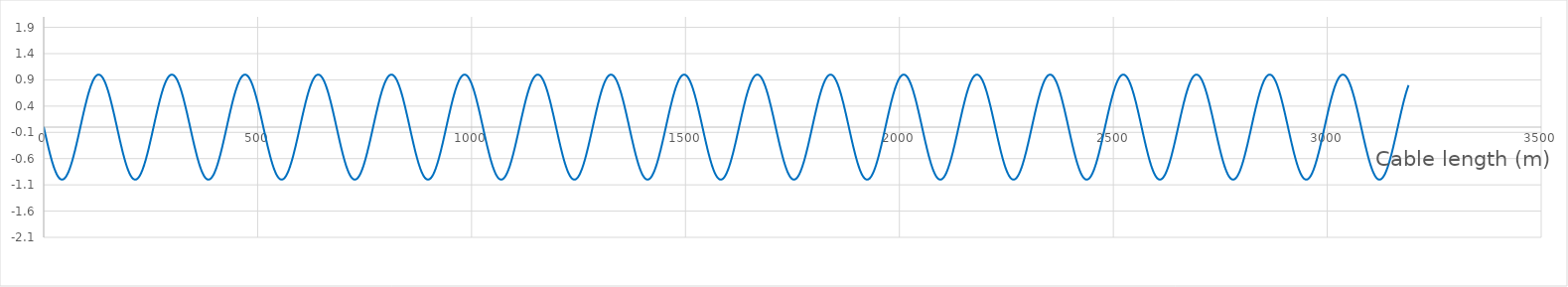
| Category | Incoming wave |
|---|---|
| 0.0 | 0.006 |
| 3.19 | -0.111 |
| 6.38 | -0.227 |
| 9.57 | -0.339 |
| 12.76 | -0.447 |
| 15.95 | -0.548 |
| 19.14 | -0.642 |
| 22.330000000000002 | -0.727 |
| 25.520000000000003 | -0.803 |
| 28.710000000000004 | -0.867 |
| 31.900000000000006 | -0.919 |
| 35.09 | -0.959 |
| 38.28 | -0.986 |
| 41.47 | -0.999 |
| 44.66 | -0.998 |
| 47.849999999999994 | -0.984 |
| 51.03999999999999 | -0.956 |
| 54.22999999999999 | -0.915 |
| 57.41999999999999 | -0.861 |
| 60.609999999999985 | -0.796 |
| 63.79999999999998 | -0.72 |
| 66.98999999999998 | -0.634 |
| 70.17999999999998 | -0.539 |
| 73.36999999999998 | -0.437 |
| 76.55999999999997 | -0.329 |
| 79.74999999999997 | -0.216 |
| 82.93999999999997 | -0.101 |
| 86.12999999999997 | 0.016 |
| 89.31999999999996 | 0.133 |
| 92.50999999999996 | 0.248 |
| 95.69999999999996 | 0.36 |
| 98.88999999999996 | 0.466 |
| 102.07999999999996 | 0.566 |
| 105.26999999999995 | 0.659 |
| 108.45999999999995 | 0.742 |
| 111.64999999999995 | 0.816 |
| 114.83999999999995 | 0.878 |
| 118.02999999999994 | 0.928 |
| 121.21999999999994 | 0.965 |
| 124.40999999999994 | 0.989 |
| 127.59999999999994 | 1 |
| 130.78999999999994 | 0.996 |
| 133.97999999999993 | 0.979 |
| 137.16999999999993 | 0.949 |
| 140.35999999999993 | 0.906 |
| 143.54999999999993 | 0.85 |
| 146.73999999999992 | 0.783 |
| 149.92999999999992 | 0.705 |
| 153.11999999999992 | 0.617 |
| 156.30999999999992 | 0.521 |
| 159.49999999999991 | 0.417 |
| 162.6899999999999 | 0.308 |
| 165.8799999999999 | 0.195 |
| 169.0699999999999 | 0.079 |
| 172.2599999999999 | -0.038 |
| 175.4499999999999 | -0.155 |
| 178.6399999999999 | -0.269 |
| 181.8299999999999 | -0.38 |
| 185.0199999999999 | -0.486 |
| 188.2099999999999 | -0.585 |
| 191.3999999999999 | -0.675 |
| 194.5899999999999 | -0.757 |
| 197.7799999999999 | -0.828 |
| 200.96999999999989 | -0.888 |
| 204.15999999999988 | -0.936 |
| 207.34999999999988 | -0.97 |
| 210.53999999999988 | -0.992 |
| 213.72999999999988 | -1 |
| 216.91999999999987 | -0.994 |
| 220.10999999999987 | -0.975 |
| 223.29999999999987 | -0.942 |
| 226.48999999999987 | -0.896 |
| 229.67999999999986 | -0.838 |
| 232.86999999999986 | -0.769 |
| 236.05999999999986 | -0.689 |
| 239.24999999999986 | -0.599 |
| 242.43999999999986 | -0.502 |
| 245.62999999999985 | -0.397 |
| 248.81999999999985 | -0.287 |
| 252.00999999999985 | -0.173 |
| 255.19999999999985 | -0.057 |
| 258.3899999999999 | 0.06 |
| 261.57999999999987 | 0.177 |
| 264.76999999999987 | 0.291 |
| 267.95999999999987 | 0.4 |
| 271.14999999999986 | 0.505 |
| 274.33999999999986 | 0.602 |
| 277.52999999999986 | 0.691 |
| 280.71999999999986 | 0.771 |
| 283.90999999999985 | 0.84 |
| 287.09999999999985 | 0.898 |
| 290.28999999999985 | 0.943 |
| 293.47999999999985 | 0.976 |
| 296.66999999999985 | 0.995 |
| 299.85999999999984 | 1 |
| 303.04999999999984 | 0.992 |
| 306.23999999999984 | 0.97 |
| 309.42999999999984 | 0.934 |
| 312.61999999999983 | 0.886 |
| 315.80999999999983 | 0.826 |
| 318.99999999999983 | 0.755 |
| 322.1899999999998 | 0.673 |
| 325.3799999999998 | 0.582 |
| 328.5699999999998 | 0.482 |
| 331.7599999999998 | 0.377 |
| 334.9499999999998 | 0.266 |
| 338.1399999999998 | 0.151 |
| 341.3299999999998 | 0.035 |
| 344.5199999999998 | -0.082 |
| 347.7099999999998 | -0.198 |
| 350.8999999999998 | -0.312 |
| 354.0899999999998 | -0.42 |
| 357.2799999999998 | -0.524 |
| 360.4699999999998 | -0.62 |
| 363.6599999999998 | -0.707 |
| 366.8499999999998 | -0.785 |
| 370.0399999999998 | -0.852 |
| 373.2299999999998 | -0.907 |
| 376.4199999999998 | -0.95 |
| 379.6099999999998 | -0.98 |
| 382.7999999999998 | -0.997 |
| 385.9899999999998 | -0.999 |
| 389.1799999999998 | -0.988 |
| 392.3699999999998 | -0.964 |
| 395.5599999999998 | -0.926 |
| 398.7499999999998 | -0.876 |
| 401.93999999999977 | -0.813 |
| 405.12999999999977 | -0.74 |
| 408.31999999999977 | -0.656 |
| 411.50999999999976 | -0.563 |
| 414.69999999999976 | -0.463 |
| 417.88999999999976 | -0.356 |
| 421.07999999999976 | -0.245 |
| 424.26999999999975 | -0.13 |
| 427.45999999999975 | -0.013 |
| 430.64999999999975 | 0.104 |
| 433.83999999999975 | 0.22 |
| 437.02999999999975 | 0.332 |
| 440.21999999999974 | 0.44 |
| 443.40999999999974 | 0.542 |
| 446.59999999999974 | 0.637 |
| 449.78999999999974 | 0.723 |
| 452.97999999999973 | 0.798 |
| 456.16999999999973 | 0.863 |
| 459.35999999999973 | 0.916 |
| 462.5499999999997 | 0.957 |
| 465.7399999999997 | 0.984 |
| 468.9299999999997 | 0.998 |
| 472.1199999999997 | 0.998 |
| 475.3099999999997 | 0.985 |
| 478.4999999999997 | 0.958 |
| 481.6899999999997 | 0.918 |
| 484.8799999999997 | 0.865 |
| 488.0699999999997 | 0.8 |
| 491.2599999999997 | 0.725 |
| 494.4499999999997 | 0.639 |
| 497.6399999999997 | 0.545 |
| 500.8299999999997 | 0.443 |
| 504.0199999999997 | 0.336 |
| 507.2099999999997 | 0.223 |
| 510.3999999999997 | 0.108 |
| 513.5899999999997 | -0.009 |
| 516.7799999999997 | -0.126 |
| 519.9699999999998 | -0.241 |
| 523.1599999999999 | -0.353 |
| 526.3499999999999 | -0.46 |
| 529.54 | -0.561 |
| 532.73 | -0.654 |
| 535.9200000000001 | -0.738 |
| 539.1100000000001 | -0.811 |
| 542.3000000000002 | -0.874 |
| 545.4900000000002 | -0.925 |
| 548.6800000000003 | -0.963 |
| 551.8700000000003 | -0.988 |
| 555.0600000000004 | -0.999 |
| 558.2500000000005 | -0.997 |
| 561.4400000000005 | -0.981 |
| 564.6300000000006 | -0.951 |
| 567.8200000000006 | -0.909 |
| 571.0100000000007 | -0.854 |
| 574.2000000000007 | -0.787 |
| 577.3900000000008 | -0.71 |
| 580.5800000000008 | -0.622 |
| 583.7700000000009 | -0.527 |
| 586.960000000001 | -0.424 |
| 590.150000000001 | -0.315 |
| 593.340000000001 | -0.202 |
| 596.5300000000011 | -0.086 |
| 599.7200000000012 | 0.031 |
| 602.9100000000012 | 0.148 |
| 606.1000000000013 | 0.263 |
| 609.2900000000013 | 0.374 |
| 612.4800000000014 | 0.479 |
| 615.6700000000014 | 0.579 |
| 618.8600000000015 | 0.67 |
| 622.0500000000015 | 0.752 |
| 625.2400000000016 | 0.824 |
| 628.4300000000017 | 0.885 |
| 631.6200000000017 | 0.933 |
| 634.8100000000018 | 0.969 |
| 638.0000000000018 | 0.991 |
| 641.1900000000019 | 1 |
| 644.3800000000019 | 0.995 |
| 647.570000000002 | 0.976 |
| 650.760000000002 | 0.944 |
| 653.9500000000021 | 0.899 |
| 657.1400000000021 | 0.842 |
| 660.3300000000022 | 0.773 |
| 663.5200000000023 | 0.694 |
| 666.7100000000023 | 0.605 |
| 669.9000000000024 | 0.508 |
| 673.0900000000024 | 0.403 |
| 676.2800000000025 | 0.294 |
| 679.4700000000025 | 0.18 |
| 682.6600000000026 | 0.064 |
| 685.8500000000026 | -0.053 |
| 689.0400000000027 | -0.17 |
| 692.2300000000027 | -0.284 |
| 695.4200000000028 | -0.394 |
| 698.6100000000029 | -0.499 |
| 701.8000000000029 | -0.597 |
| 704.990000000003 | -0.686 |
| 708.180000000003 | -0.767 |
| 711.3700000000031 | -0.836 |
| 714.5600000000031 | -0.895 |
| 717.7500000000032 | -0.941 |
| 720.9400000000032 | -0.974 |
| 724.1300000000033 | -0.994 |
| 727.3200000000033 | -1 |
| 730.5100000000034 | -0.992 |
| 733.7000000000035 | -0.971 |
| 736.8900000000035 | -0.937 |
| 740.0800000000036 | -0.89 |
| 743.2700000000036 | -0.83 |
| 746.4600000000037 | -0.759 |
| 749.6500000000037 | -0.678 |
| 752.8400000000038 | -0.587 |
| 756.0300000000038 | -0.489 |
| 759.2200000000039 | -0.383 |
| 762.410000000004 | -0.273 |
| 765.600000000004 | -0.158 |
| 768.790000000004 | -0.042 |
| 771.9800000000041 | 0.075 |
| 775.1700000000042 | 0.191 |
| 778.3600000000042 | 0.305 |
| 781.5500000000043 | 0.414 |
| 784.7400000000043 | 0.518 |
| 787.9300000000044 | 0.614 |
| 791.1200000000044 | 0.702 |
| 794.3100000000045 | 0.781 |
| 797.5000000000045 | 0.848 |
| 800.6900000000046 | 0.904 |
| 803.8800000000047 | 0.948 |
| 807.0700000000047 | 0.979 |
| 810.2600000000048 | 0.996 |
| 813.4500000000048 | 1 |
| 816.6400000000049 | 0.99 |
| 819.8300000000049 | 0.966 |
| 823.020000000005 | 0.929 |
| 826.210000000005 | 0.879 |
| 829.4000000000051 | 0.818 |
| 832.5900000000051 | 0.745 |
| 835.7800000000052 | 0.661 |
| 838.9700000000053 | 0.569 |
| 842.1600000000053 | 0.469 |
| 845.3500000000054 | 0.363 |
| 848.5400000000054 | 0.251 |
| 851.7300000000055 | 0.137 |
| 854.9200000000055 | 0.02 |
| 858.1100000000056 | -0.097 |
| 861.3000000000056 | -0.213 |
| 864.4900000000057 | -0.326 |
| 867.6800000000057 | -0.434 |
| 870.8700000000058 | -0.536 |
| 874.0600000000059 | -0.631 |
| 877.2500000000059 | -0.718 |
| 880.440000000006 | -0.794 |
| 883.630000000006 | -0.86 |
| 886.8200000000061 | -0.914 |
| 890.0100000000061 | -0.955 |
| 893.2000000000062 | -0.983 |
| 896.3900000000062 | -0.998 |
| 899.5800000000063 | -0.999 |
| 902.7700000000063 | -0.986 |
| 905.9600000000064 | -0.96 |
| 909.1500000000065 | -0.921 |
| 912.3400000000065 | -0.869 |
| 915.5300000000066 | -0.805 |
| 918.7200000000066 | -0.73 |
| 921.9100000000067 | -0.645 |
| 925.1000000000067 | -0.551 |
| 928.2900000000068 | -0.45 |
| 931.4800000000068 | -0.342 |
| 934.6700000000069 | -0.23 |
| 937.860000000007 | -0.115 |
| 941.050000000007 | 0.002 |
| 944.2400000000071 | 0.119 |
| 947.4300000000071 | 0.234 |
| 950.6200000000072 | 0.346 |
| 953.8100000000072 | 0.454 |
| 957.0000000000073 | 0.555 |
| 960.1900000000073 | 0.648 |
| 963.3800000000074 | 0.733 |
| 966.5700000000074 | 0.807 |
| 969.7600000000075 | 0.871 |
| 972.9500000000075 | 0.922 |
| 976.1400000000076 | 0.961 |
| 979.3300000000077 | 0.987 |
| 982.5200000000077 | 0.999 |
| 985.7100000000078 | 0.997 |
| 988.9000000000078 | 0.982 |
| 992.0900000000079 | 0.953 |
| 995.2800000000079 | 0.912 |
| 998.470000000008 | 0.857 |
| 1001.660000000008 | 0.791 |
| 1004.8500000000081 | 0.715 |
| 1008.0400000000081 | 0.628 |
| 1011.2300000000082 | 0.533 |
| 1014.4200000000083 | 0.43 |
| 1017.6100000000083 | 0.321 |
| 1020.8000000000084 | 0.209 |
| 1023.9900000000084 | 0.093 |
| 1027.1800000000085 | -0.024 |
| 1030.3700000000085 | -0.141 |
| 1033.5600000000086 | -0.256 |
| 1036.7500000000086 | -0.367 |
| 1039.9400000000087 | -0.473 |
| 1043.1300000000087 | -0.573 |
| 1046.3200000000088 | -0.665 |
| 1049.5100000000089 | -0.748 |
| 1052.700000000009 | -0.82 |
| 1055.890000000009 | -0.881 |
| 1059.080000000009 | -0.931 |
| 1062.270000000009 | -0.967 |
| 1065.4600000000091 | -0.99 |
| 1068.6500000000092 | -1 |
| 1071.8400000000092 | -0.996 |
| 1075.0300000000093 | -0.978 |
| 1078.2200000000093 | -0.947 |
| 1081.4100000000094 | -0.902 |
| 1084.6000000000095 | -0.846 |
| 1087.7900000000095 | -0.778 |
| 1090.9800000000096 | -0.699 |
| 1094.1700000000096 | -0.611 |
| 1097.3600000000097 | -0.514 |
| 1100.5500000000097 | -0.41 |
| 1103.7400000000098 | -0.301 |
| 1106.9300000000098 | -0.187 |
| 1110.12000000001 | -0.071 |
| 1113.31000000001 | 0.046 |
| 1116.50000000001 | 0.163 |
| 1119.69000000001 | 0.277 |
| 1122.88000000001 | 0.387 |
| 1126.0700000000102 | 0.492 |
| 1129.2600000000102 | 0.591 |
| 1132.4500000000103 | 0.681 |
| 1135.6400000000103 | 0.762 |
| 1138.8300000000104 | 0.833 |
| 1142.0200000000104 | 0.892 |
| 1145.2100000000105 | 0.938 |
| 1148.4000000000106 | 0.972 |
| 1151.5900000000106 | 0.993 |
| 1154.7800000000107 | 1 |
| 1157.9700000000107 | 0.993 |
| 1161.1600000000108 | 0.973 |
| 1164.3500000000108 | 0.939 |
| 1167.5400000000109 | 0.893 |
| 1170.730000000011 | 0.834 |
| 1173.920000000011 | 0.764 |
| 1177.110000000011 | 0.683 |
| 1180.300000000011 | 0.593 |
| 1183.4900000000112 | 0.495 |
| 1186.6800000000112 | 0.39 |
| 1189.8700000000113 | 0.279 |
| 1193.0600000000113 | 0.165 |
| 1196.2500000000114 | 0.049 |
| 1199.4400000000114 | -0.068 |
| 1202.6300000000115 | -0.184 |
| 1205.8200000000115 | -0.298 |
| 1209.0100000000116 | -0.408 |
| 1212.2000000000116 | -0.512 |
| 1215.3900000000117 | -0.608 |
| 1218.5800000000118 | -0.697 |
| 1221.7700000000118 | -0.776 |
| 1224.9600000000119 | -0.845 |
| 1228.150000000012 | -0.901 |
| 1231.340000000012 | -0.946 |
| 1234.530000000012 | -0.977 |
| 1237.720000000012 | -0.995 |
| 1240.9100000000121 | -1 |
| 1244.1000000000122 | -0.991 |
| 1247.2900000000122 | -0.968 |
| 1250.4800000000123 | -0.932 |
| 1253.6700000000124 | -0.883 |
| 1256.8600000000124 | -0.822 |
| 1260.0500000000125 | -0.749 |
| 1263.2400000000125 | -0.667 |
| 1266.4300000000126 | -0.575 |
| 1269.6200000000126 | -0.476 |
| 1272.8100000000127 | -0.369 |
| 1276.0000000000127 | -0.258 |
| 1279.1900000000128 | -0.144 |
| 1282.3800000000128 | -0.027 |
| 1285.570000000013 | 0.09 |
| 1288.760000000013 | 0.206 |
| 1291.950000000013 | 0.319 |
| 1295.140000000013 | 0.428 |
| 1298.3300000000131 | 0.53 |
| 1301.5200000000132 | 0.626 |
| 1304.7100000000132 | 0.713 |
| 1307.9000000000133 | 0.79 |
| 1311.0900000000133 | 0.856 |
| 1314.2800000000134 | 0.911 |
| 1317.4700000000134 | 0.953 |
| 1320.6600000000135 | 0.982 |
| 1323.8500000000136 | 0.997 |
| 1327.0400000000136 | 0.999 |
| 1330.2300000000137 | 0.987 |
| 1333.4200000000137 | 0.962 |
| 1336.6100000000138 | 0.923 |
| 1339.8000000000138 | 0.872 |
| 1342.9900000000139 | 0.809 |
| 1346.180000000014 | 0.735 |
| 1349.370000000014 | 0.65 |
| 1352.560000000014 | 0.557 |
| 1355.750000000014 | 0.456 |
| 1358.9400000000142 | 0.349 |
| 1362.1300000000142 | 0.237 |
| 1365.3200000000143 | 0.122 |
| 1368.5100000000143 | 0.005 |
| 1371.7000000000144 | -0.112 |
| 1374.8900000000144 | -0.227 |
| 1378.0800000000145 | -0.34 |
| 1381.2700000000145 | -0.447 |
| 1384.4600000000146 | -0.549 |
| 1387.6500000000146 | -0.643 |
| 1390.8400000000147 | -0.728 |
| 1394.0300000000148 | -0.803 |
| 1397.2200000000148 | -0.867 |
| 1400.4100000000149 | -0.92 |
| 1403.600000000015 | -0.959 |
| 1406.790000000015 | -0.986 |
| 1409.980000000015 | -0.999 |
| 1413.170000000015 | -0.998 |
| 1416.3600000000151 | -0.983 |
| 1419.5500000000152 | -0.956 |
| 1422.7400000000152 | -0.915 |
| 1425.9300000000153 | -0.861 |
| 1429.1200000000154 | -0.796 |
| 1432.3100000000154 | -0.719 |
| 1435.5000000000155 | -0.633 |
| 1438.6900000000155 | -0.539 |
| 1441.8800000000156 | -0.436 |
| 1445.0700000000156 | -0.328 |
| 1448.2600000000157 | -0.215 |
| 1451.4500000000157 | -0.1 |
| 1454.6400000000158 | 0.017 |
| 1457.8300000000158 | 0.134 |
| 1461.020000000016 | 0.249 |
| 1464.210000000016 | 0.36 |
| 1467.400000000016 | 0.467 |
| 1470.590000000016 | 0.567 |
| 1473.7800000000161 | 0.66 |
| 1476.9700000000162 | 0.743 |
| 1480.1600000000162 | 0.816 |
| 1483.3500000000163 | 0.878 |
| 1486.5400000000163 | 0.928 |
| 1489.7300000000164 | 0.965 |
| 1492.9200000000164 | 0.989 |
| 1496.1100000000165 | 1 |
| 1499.3000000000166 | 0.996 |
| 1502.4900000000166 | 0.979 |
| 1505.6800000000167 | 0.949 |
| 1508.8700000000167 | 0.905 |
| 1512.0600000000168 | 0.85 |
| 1515.2500000000168 | 0.782 |
| 1518.4400000000169 | 0.704 |
| 1521.630000000017 | 0.616 |
| 1524.820000000017 | 0.52 |
| 1528.010000000017 | 0.416 |
| 1531.200000000017 | 0.307 |
| 1534.3900000000172 | 0.194 |
| 1537.5800000000172 | 0.078 |
| 1540.7700000000173 | -0.039 |
| 1543.9600000000173 | -0.156 |
| 1547.1500000000174 | -0.27 |
| 1550.3400000000174 | -0.381 |
| 1553.5300000000175 | -0.486 |
| 1556.7200000000175 | -0.585 |
| 1559.9100000000176 | -0.676 |
| 1563.1000000000176 | -0.757 |
| 1566.2900000000177 | -0.829 |
| 1569.4800000000178 | -0.888 |
| 1572.6700000000178 | -0.936 |
| 1575.8600000000179 | -0.971 |
| 1579.050000000018 | -0.992 |
| 1582.240000000018 | -1 |
| 1585.430000000018 | -0.994 |
| 1588.620000000018 | -0.975 |
| 1591.8100000000181 | -0.942 |
| 1595.0000000000182 | -0.896 |
| 1598.1900000000182 | -0.838 |
| 1601.3800000000183 | -0.768 |
| 1604.5700000000184 | -0.688 |
| 1607.7600000000184 | -0.599 |
| 1610.9500000000185 | -0.501 |
| 1614.1400000000185 | -0.396 |
| 1617.3300000000186 | -0.286 |
| 1620.5200000000186 | -0.172 |
| 1623.7100000000187 | -0.056 |
| 1626.9000000000187 | 0.061 |
| 1630.0900000000188 | 0.177 |
| 1633.2800000000188 | 0.291 |
| 1636.470000000019 | 0.401 |
| 1639.660000000019 | 0.505 |
| 1642.850000000019 | 0.603 |
| 1646.040000000019 | 0.692 |
| 1649.2300000000191 | 0.772 |
| 1652.4200000000192 | 0.841 |
| 1655.6100000000192 | 0.898 |
| 1658.8000000000193 | 0.943 |
| 1661.9900000000193 | 0.976 |
| 1665.1800000000194 | 0.995 |
| 1668.3700000000194 | 1 |
| 1671.5600000000195 | 0.991 |
| 1674.7500000000196 | 0.969 |
| 1677.9400000000196 | 0.934 |
| 1681.1300000000197 | 0.886 |
| 1684.3200000000197 | 0.826 |
| 1687.5100000000198 | 0.754 |
| 1690.7000000000198 | 0.672 |
| 1693.8900000000199 | 0.581 |
| 1697.08000000002 | 0.482 |
| 1700.27000000002 | 0.376 |
| 1703.46000000002 | 0.265 |
| 1706.65000000002 | 0.151 |
| 1709.8400000000202 | 0.034 |
| 1713.0300000000202 | -0.083 |
| 1716.2200000000203 | -0.199 |
| 1719.4100000000203 | -0.312 |
| 1722.6000000000204 | -0.421 |
| 1725.7900000000204 | -0.524 |
| 1728.9800000000205 | -0.62 |
| 1732.1700000000205 | -0.708 |
| 1735.3600000000206 | -0.785 |
| 1738.5500000000206 | -0.852 |
| 1741.7400000000207 | -0.908 |
| 1744.9300000000208 | -0.951 |
| 1748.1200000000208 | -0.98 |
| 1751.3100000000209 | -0.997 |
| 1754.500000000021 | -0.999 |
| 1757.690000000021 | -0.988 |
| 1760.880000000021 | -0.964 |
| 1764.070000000021 | -0.926 |
| 1767.2600000000211 | -0.875 |
| 1770.4500000000212 | -0.813 |
| 1773.6400000000212 | -0.739 |
| 1776.8300000000213 | -0.656 |
| 1780.0200000000214 | -0.563 |
| 1783.2100000000214 | -0.462 |
| 1786.4000000000215 | -0.355 |
| 1789.5900000000215 | -0.244 |
| 1792.7800000000216 | -0.129 |
| 1795.9700000000216 | -0.012 |
| 1799.1600000000217 | 0.105 |
| 1802.3500000000217 | 0.221 |
| 1805.5400000000218 | 0.333 |
| 1808.7300000000218 | 0.441 |
| 1811.920000000022 | 0.543 |
| 1815.110000000022 | 0.637 |
| 1818.300000000022 | 0.723 |
| 1821.490000000022 | 0.799 |
| 1824.6800000000221 | 0.864 |
| 1827.8700000000222 | 0.917 |
| 1831.0600000000222 | 0.957 |
| 1834.2500000000223 | 0.984 |
| 1837.4400000000223 | 0.998 |
| 1840.6300000000224 | 0.998 |
| 1843.8200000000224 | 0.985 |
| 1847.0100000000225 | 0.958 |
| 1850.2000000000226 | 0.917 |
| 1853.3900000000226 | 0.865 |
| 1856.5800000000227 | 0.8 |
| 1859.7700000000227 | 0.724 |
| 1862.9600000000228 | 0.639 |
| 1866.1500000000228 | 0.544 |
| 1869.3400000000229 | 0.443 |
| 1872.530000000023 | 0.335 |
| 1875.720000000023 | 0.222 |
| 1878.910000000023 | 0.107 |
| 1882.100000000023 | -0.01 |
| 1885.2900000000232 | -0.127 |
| 1888.4800000000232 | -0.242 |
| 1891.6700000000233 | -0.354 |
| 1894.8600000000233 | -0.461 |
| 1898.0500000000234 | -0.561 |
| 1901.2400000000234 | -0.654 |
| 1904.4300000000235 | -0.738 |
| 1907.6200000000235 | -0.812 |
| 1910.8100000000236 | -0.875 |
| 1914.0000000000236 | -0.925 |
| 1917.1900000000237 | -0.963 |
| 1920.3800000000238 | -0.988 |
| 1923.5700000000238 | -0.999 |
| 1926.7600000000239 | -0.997 |
| 1929.950000000024 | -0.981 |
| 1933.140000000024 | -0.951 |
| 1936.330000000024 | -0.908 |
| 1939.520000000024 | -0.853 |
| 1942.7100000000241 | -0.787 |
| 1945.9000000000242 | -0.709 |
| 1949.0900000000242 | -0.622 |
| 1952.2800000000243 | -0.526 |
| 1955.4700000000244 | -0.423 |
| 1958.6600000000244 | -0.314 |
| 1961.8500000000245 | -0.201 |
| 1965.0400000000245 | -0.085 |
| 1968.2300000000246 | 0.032 |
| 1971.4200000000246 | 0.149 |
| 1974.6100000000247 | 0.263 |
| 1977.8000000000247 | 0.374 |
| 1980.9900000000248 | 0.48 |
| 1984.1800000000248 | 0.579 |
| 1987.370000000025 | 0.671 |
| 1990.560000000025 | 0.753 |
| 1993.750000000025 | 0.825 |
| 1996.940000000025 | 0.885 |
| 2000.1300000000251 | 0.933 |
| 2003.3200000000252 | 0.969 |
| 2006.5100000000252 | 0.991 |
| 2009.7000000000253 | 1 |
| 2012.8900000000253 | 0.995 |
| 2016.0800000000254 | 0.976 |
| 2019.2700000000254 | 0.944 |
| 2022.4600000000255 | 0.899 |
| 2025.6500000000256 | 0.842 |
| 2028.8400000000256 | 0.773 |
| 2032.0300000000257 | 0.693 |
| 2035.2200000000257 | 0.604 |
| 2038.4100000000258 | 0.507 |
| 2041.6000000000258 | 0.403 |
| 2044.7900000000259 | 0.293 |
| 2047.980000000026 | 0.179 |
| 2051.170000000026 | 0.063 |
| 2054.360000000026 | -0.054 |
| 2057.550000000026 | -0.17 |
| 2060.740000000026 | -0.284 |
| 2063.930000000026 | -0.395 |
| 2067.1200000000263 | -0.499 |
| 2070.3100000000263 | -0.597 |
| 2073.5000000000264 | -0.687 |
| 2076.6900000000264 | -0.767 |
| 2079.8800000000265 | -0.837 |
| 2083.0700000000265 | -0.895 |
| 2086.2600000000266 | -0.941 |
| 2089.4500000000266 | -0.974 |
| 2092.6400000000267 | -0.994 |
| 2095.8300000000268 | -1 |
| 2099.020000000027 | -0.992 |
| 2102.210000000027 | -0.971 |
| 2105.400000000027 | -0.937 |
| 2108.590000000027 | -0.889 |
| 2111.780000000027 | -0.83 |
| 2114.970000000027 | -0.759 |
| 2118.160000000027 | -0.677 |
| 2121.350000000027 | -0.587 |
| 2124.5400000000272 | -0.488 |
| 2127.7300000000273 | -0.383 |
| 2130.9200000000274 | -0.272 |
| 2134.1100000000274 | -0.158 |
| 2137.3000000000275 | -0.041 |
| 2140.4900000000275 | 0.076 |
| 2143.6800000000276 | 0.192 |
| 2146.8700000000276 | 0.306 |
| 2150.0600000000277 | 0.415 |
| 2153.2500000000277 | 0.518 |
| 2156.440000000028 | 0.615 |
| 2159.630000000028 | 0.703 |
| 2162.820000000028 | 0.781 |
| 2166.010000000028 | 0.849 |
| 2169.200000000028 | 0.905 |
| 2172.390000000028 | 0.948 |
| 2175.580000000028 | 0.979 |
| 2178.770000000028 | 0.996 |
| 2181.9600000000282 | 1 |
| 2185.1500000000283 | 0.989 |
| 2188.3400000000283 | 0.966 |
| 2191.5300000000284 | 0.929 |
| 2194.7200000000284 | 0.879 |
| 2197.9100000000285 | 0.817 |
| 2201.1000000000286 | 0.744 |
| 2204.2900000000286 | 0.661 |
| 2207.4800000000287 | 0.569 |
| 2210.6700000000287 | 0.469 |
| 2213.860000000029 | 0.362 |
| 2217.050000000029 | 0.251 |
| 2220.240000000029 | 0.136 |
| 2223.430000000029 | 0.019 |
| 2226.620000000029 | -0.098 |
| 2229.810000000029 | -0.214 |
| 2233.000000000029 | -0.326 |
| 2236.190000000029 | -0.435 |
| 2239.380000000029 | -0.537 |
| 2242.5700000000293 | -0.632 |
| 2245.7600000000293 | -0.718 |
| 2248.9500000000294 | -0.795 |
| 2252.1400000000294 | -0.86 |
| 2255.3300000000295 | -0.914 |
| 2258.5200000000295 | -0.955 |
| 2261.7100000000296 | -0.983 |
| 2264.9000000000296 | -0.998 |
| 2268.0900000000297 | -0.999 |
| 2271.2800000000298 | -0.986 |
| 2274.47000000003 | -0.96 |
| 2277.66000000003 | -0.92 |
| 2280.85000000003 | -0.868 |
| 2284.04000000003 | -0.804 |
| 2287.23000000003 | -0.729 |
| 2290.42000000003 | -0.644 |
| 2293.61000000003 | -0.55 |
| 2296.80000000003 | -0.449 |
| 2299.9900000000302 | -0.341 |
| 2303.1800000000303 | -0.229 |
| 2306.3700000000304 | -0.114 |
| 2309.5600000000304 | 0.003 |
| 2312.7500000000305 | 0.12 |
| 2315.9400000000305 | 0.235 |
| 2319.1300000000306 | 0.347 |
| 2322.3200000000306 | 0.454 |
| 2325.5100000000307 | 0.555 |
| 2328.7000000000307 | 0.649 |
| 2331.890000000031 | 0.733 |
| 2335.080000000031 | 0.808 |
| 2338.270000000031 | 0.871 |
| 2341.460000000031 | 0.923 |
| 2344.650000000031 | 0.961 |
| 2347.840000000031 | 0.987 |
| 2351.030000000031 | 0.999 |
| 2354.220000000031 | 0.997 |
| 2357.4100000000312 | 0.982 |
| 2360.6000000000313 | 0.953 |
| 2363.7900000000313 | 0.911 |
| 2366.9800000000314 | 0.857 |
| 2370.1700000000315 | 0.791 |
| 2373.3600000000315 | 0.714 |
| 2376.5500000000316 | 0.627 |
| 2379.7400000000316 | 0.532 |
| 2382.9300000000317 | 0.429 |
| 2386.1200000000317 | 0.321 |
| 2389.310000000032 | 0.208 |
| 2392.500000000032 | 0.092 |
| 2395.690000000032 | -0.025 |
| 2398.880000000032 | -0.142 |
| 2402.070000000032 | -0.256 |
| 2405.260000000032 | -0.368 |
| 2408.450000000032 | -0.474 |
| 2411.640000000032 | -0.574 |
| 2414.830000000032 | -0.665 |
| 2418.0200000000323 | -0.748 |
| 2421.2100000000323 | -0.821 |
| 2424.4000000000324 | -0.882 |
| 2427.5900000000324 | -0.931 |
| 2430.7800000000325 | -0.967 |
| 2433.9700000000325 | -0.99 |
| 2437.1600000000326 | -1 |
| 2440.3500000000327 | -0.996 |
| 2443.5400000000327 | -0.978 |
| 2446.7300000000328 | -0.946 |
| 2449.920000000033 | -0.902 |
| 2453.110000000033 | -0.845 |
| 2456.300000000033 | -0.777 |
| 2459.490000000033 | -0.698 |
| 2462.680000000033 | -0.61 |
| 2465.870000000033 | -0.513 |
| 2469.060000000033 | -0.409 |
| 2472.250000000033 | -0.3 |
| 2475.4400000000333 | -0.186 |
| 2478.6300000000333 | -0.07 |
| 2481.8200000000334 | 0.047 |
| 2485.0100000000334 | 0.163 |
| 2488.2000000000335 | 0.278 |
| 2491.3900000000335 | 0.388 |
| 2494.5800000000336 | 0.493 |
| 2497.7700000000336 | 0.591 |
| 2500.9600000000337 | 0.682 |
| 2504.1500000000337 | 0.763 |
| 2507.340000000034 | 0.833 |
| 2510.530000000034 | 0.892 |
| 2513.720000000034 | 0.939 |
| 2516.910000000034 | 0.973 |
| 2520.100000000034 | 0.993 |
| 2523.290000000034 | 1 |
| 2526.480000000034 | 0.993 |
| 2529.670000000034 | 0.973 |
| 2532.8600000000342 | 0.939 |
| 2536.0500000000343 | 0.892 |
| 2539.2400000000343 | 0.834 |
| 2542.4300000000344 | 0.763 |
| 2545.6200000000345 | 0.682 |
| 2548.8100000000345 | 0.592 |
| 2552.0000000000346 | 0.494 |
| 2555.1900000000346 | 0.389 |
| 2558.3800000000347 | 0.279 |
| 2561.5700000000347 | 0.165 |
| 2564.760000000035 | 0.048 |
| 2567.950000000035 | -0.069 |
| 2571.140000000035 | -0.185 |
| 2574.330000000035 | -0.299 |
| 2577.520000000035 | -0.408 |
| 2580.710000000035 | -0.512 |
| 2583.900000000035 | -0.609 |
| 2587.090000000035 | -0.698 |
| 2590.280000000035 | -0.777 |
| 2593.4700000000353 | -0.845 |
| 2596.6600000000353 | -0.902 |
| 2599.8500000000354 | -0.946 |
| 2603.0400000000354 | -0.977 |
| 2606.2300000000355 | -0.995 |
| 2609.4200000000355 | -1 |
| 2612.6100000000356 | -0.99 |
| 2615.8000000000357 | -0.967 |
| 2618.9900000000357 | -0.931 |
| 2622.1800000000358 | -0.882 |
| 2625.370000000036 | -0.821 |
| 2628.560000000036 | -0.749 |
| 2631.750000000036 | -0.666 |
| 2634.940000000036 | -0.574 |
| 2638.130000000036 | -0.475 |
| 2641.320000000036 | -0.369 |
| 2644.510000000036 | -0.257 |
| 2647.700000000036 | -0.143 |
| 2650.8900000000363 | -0.026 |
| 2654.0800000000363 | 0.091 |
| 2657.2700000000364 | 0.207 |
| 2660.4600000000364 | 0.32 |
| 2663.6500000000365 | 0.428 |
| 2666.8400000000365 | 0.531 |
| 2670.0300000000366 | 0.626 |
| 2673.2200000000366 | 0.713 |
| 2676.4100000000367 | 0.79 |
| 2679.6000000000367 | 0.857 |
| 2682.790000000037 | 0.911 |
| 2685.980000000037 | 0.953 |
| 2689.170000000037 | 0.982 |
| 2692.360000000037 | 0.997 |
| 2695.550000000037 | 0.999 |
| 2698.740000000037 | 0.987 |
| 2701.930000000037 | 0.962 |
| 2705.120000000037 | 0.923 |
| 2708.3100000000372 | 0.872 |
| 2711.5000000000373 | 0.808 |
| 2714.6900000000373 | 0.734 |
| 2717.8800000000374 | 0.65 |
| 2721.0700000000375 | 0.556 |
| 2724.2600000000375 | 0.455 |
| 2727.4500000000376 | 0.348 |
| 2730.6400000000376 | 0.236 |
| 2733.8300000000377 | 0.121 |
| 2737.0200000000377 | 0.004 |
| 2740.210000000038 | -0.113 |
| 2743.400000000038 | -0.228 |
| 2746.590000000038 | -0.341 |
| 2749.780000000038 | -0.448 |
| 2752.970000000038 | -0.55 |
| 2756.160000000038 | -0.643 |
| 2759.350000000038 | -0.729 |
| 2762.540000000038 | -0.804 |
| 2765.730000000038 | -0.868 |
| 2768.9200000000383 | -0.92 |
| 2772.1100000000383 | -0.959 |
| 2775.3000000000384 | -0.986 |
| 2778.4900000000384 | -0.999 |
| 2781.6800000000385 | -0.998 |
| 2784.8700000000385 | -0.983 |
| 2788.0600000000386 | -0.955 |
| 2791.2500000000387 | -0.914 |
| 2794.4400000000387 | -0.861 |
| 2797.6300000000388 | -0.795 |
| 2800.820000000039 | -0.719 |
| 2804.010000000039 | -0.633 |
| 2807.200000000039 | -0.538 |
| 2810.390000000039 | -0.436 |
| 2813.580000000039 | -0.327 |
| 2816.770000000039 | -0.215 |
| 2819.960000000039 | -0.099 |
| 2823.150000000039 | 0.018 |
| 2826.3400000000393 | 0.135 |
| 2829.5300000000393 | 0.25 |
| 2832.7200000000394 | 0.361 |
| 2835.9100000000394 | 0.468 |
| 2839.1000000000395 | 0.568 |
| 2842.2900000000395 | 0.66 |
| 2845.4800000000396 | 0.743 |
| 2848.6700000000396 | 0.817 |
| 2851.8600000000397 | 0.878 |
| 2855.0500000000397 | 0.928 |
| 2858.24000000004 | 0.965 |
| 2861.43000000004 | 0.989 |
| 2864.62000000004 | 1 |
| 2867.81000000004 | 0.996 |
| 2871.00000000004 | 0.979 |
| 2874.19000000004 | 0.949 |
| 2877.38000000004 | 0.905 |
| 2880.57000000004 | 0.849 |
| 2883.7600000000402 | 0.782 |
| 2886.9500000000403 | 0.703 |
| 2890.1400000000403 | 0.616 |
| 2893.3300000000404 | 0.519 |
| 2896.5200000000405 | 0.416 |
| 2899.7100000000405 | 0.307 |
| 2902.9000000000406 | 0.193 |
| 2906.0900000000406 | 0.077 |
| 2909.2800000000407 | -0.04 |
| 2912.4700000000407 | -0.157 |
| 2915.660000000041 | -0.271 |
| 2918.850000000041 | -0.382 |
| 2922.040000000041 | -0.487 |
| 2925.230000000041 | -0.586 |
| 2928.420000000041 | -0.677 |
| 2931.610000000041 | -0.758 |
| 2934.800000000041 | -0.829 |
| 2937.990000000041 | -0.889 |
| 2941.180000000041 | -0.936 |
| 2944.3700000000413 | -0.971 |
| 2947.5600000000413 | -0.992 |
| 2950.7500000000414 | -1 |
| 2953.9400000000414 | -0.994 |
| 2957.1300000000415 | -0.974 |
| 2960.3200000000415 | -0.941 |
| 2963.5100000000416 | -0.896 |
| 2966.7000000000417 | -0.837 |
| 2969.8900000000417 | -0.768 |
| 2973.0800000000418 | -0.688 |
| 2976.270000000042 | -0.598 |
| 2979.460000000042 | -0.5 |
| 2982.650000000042 | -0.396 |
| 2985.840000000042 | -0.285 |
| 2989.030000000042 | -0.171 |
| 2992.220000000042 | -0.055 |
| 2995.410000000042 | 0.062 |
| 2998.600000000042 | 0.178 |
| 3001.7900000000423 | 0.292 |
| 3004.9800000000423 | 0.402 |
| 3008.1700000000424 | 0.506 |
| 3011.3600000000424 | 0.603 |
| 3014.5500000000425 | 0.693 |
| 3017.7400000000425 | 0.772 |
| 3020.9300000000426 | 0.841 |
| 3024.1200000000426 | 0.899 |
| 3027.3100000000427 | 0.944 |
| 3030.5000000000427 | 0.976 |
| 3033.690000000043 | 0.995 |
| 3036.880000000043 | 1 |
| 3040.070000000043 | 0.991 |
| 3043.260000000043 | 0.969 |
| 3046.450000000043 | 0.934 |
| 3049.640000000043 | 0.886 |
| 3052.830000000043 | 0.825 |
| 3056.020000000043 | 0.753 |
| 3059.2100000000432 | 0.671 |
| 3062.4000000000433 | 0.58 |
| 3065.5900000000433 | 0.481 |
| 3068.7800000000434 | 0.375 |
| 3071.9700000000435 | 0.264 |
| 3075.1600000000435 | 0.15 |
| 3078.3500000000436 | 0.033 |
| 3081.5400000000436 | -0.084 |
| 3084.7300000000437 | -0.2 |
| 3087.9200000000437 | -0.313 |
| 3091.110000000044 | -0.422 |
| 3094.300000000044 | -0.525 |
| 3097.490000000044 | -0.621 |
| 3100.680000000044 | -0.708 |
| 3103.870000000044 | -0.786 |
| 3107.060000000044 | -0.853 |
| 3110.250000000044 | -0.908 |
| 3113.440000000044 | -0.951 |
| 3116.630000000044 | -0.98 |
| 3119.8200000000443 | -0.997 |
| 3123.0100000000443 | -0.999 |
| 3126.2000000000444 | -0.988 |
| 3129.3900000000444 | -0.964 |
| 3132.5800000000445 | -0.926 |
| 3135.7700000000445 | -0.875 |
| 3138.9600000000446 | -0.813 |
| 3142.1500000000447 | -0.739 |
| 3145.3400000000447 | -0.655 |
| 3148.5300000000448 | -0.562 |
| 3151.720000000045 | -0.462 |
| 3154.910000000045 | -0.355 |
| 3158.100000000045 | -0.243 |
| 3161.290000000045 | -0.128 |
| 3164.480000000045 | -0.011 |
| 3167.670000000045 | 0.106 |
| 3170.860000000045 | 0.221 |
| 3174.050000000045 | 0.334 |
| 3177.2400000000453 | 0.442 |
| 3180.4300000000453 | 0.544 |
| 3183.6200000000454 | 0.638 |
| 3186.8100000000454 | 0.724 |
| 3190.0000000000455 | 0.799 |